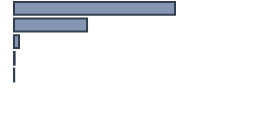
| Category | Percentatge |
|---|---|
| 0 | 67.087 |
| 1 | 30.435 |
| 2 | 2.13 |
| 3 | 0.261 |
| 4 | 0.087 |
| 5 | 0 |